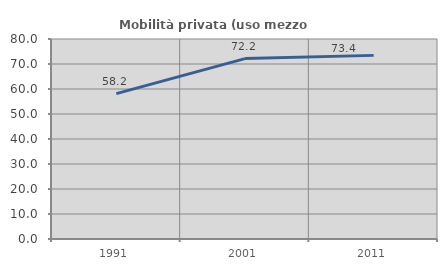
| Category | Mobilità privata (uso mezzo privato) |
|---|---|
| 1991.0 | 58.153 |
| 2001.0 | 72.164 |
| 2011.0 | 73.45 |